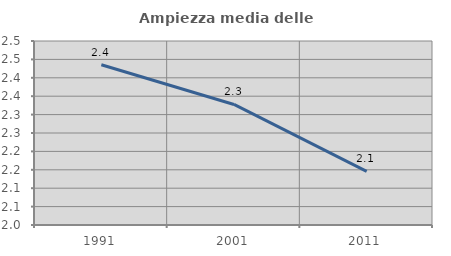
| Category | Ampiezza media delle famiglie |
|---|---|
| 1991.0 | 2.435 |
| 2001.0 | 2.328 |
| 2011.0 | 2.146 |